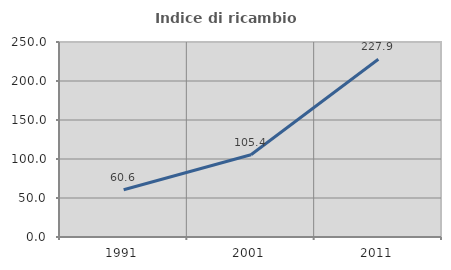
| Category | Indice di ricambio occupazionale  |
|---|---|
| 1991.0 | 60.622 |
| 2001.0 | 105.372 |
| 2011.0 | 227.907 |